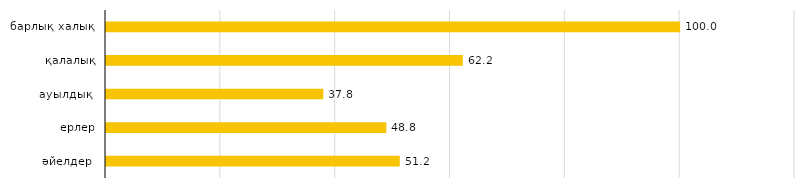
| Category | Series 0 |
|---|---|
| әйелдер  | 51.164 |
| ерлер | 48.836 |
| ауылдық  | 37.849 |
| қалалық | 62.151 |
| барлық халық  | 100 |